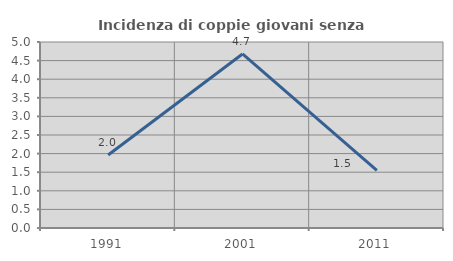
| Category | Incidenza di coppie giovani senza figli |
|---|---|
| 1991.0 | 1.961 |
| 2001.0 | 4.678 |
| 2011.0 | 1.546 |